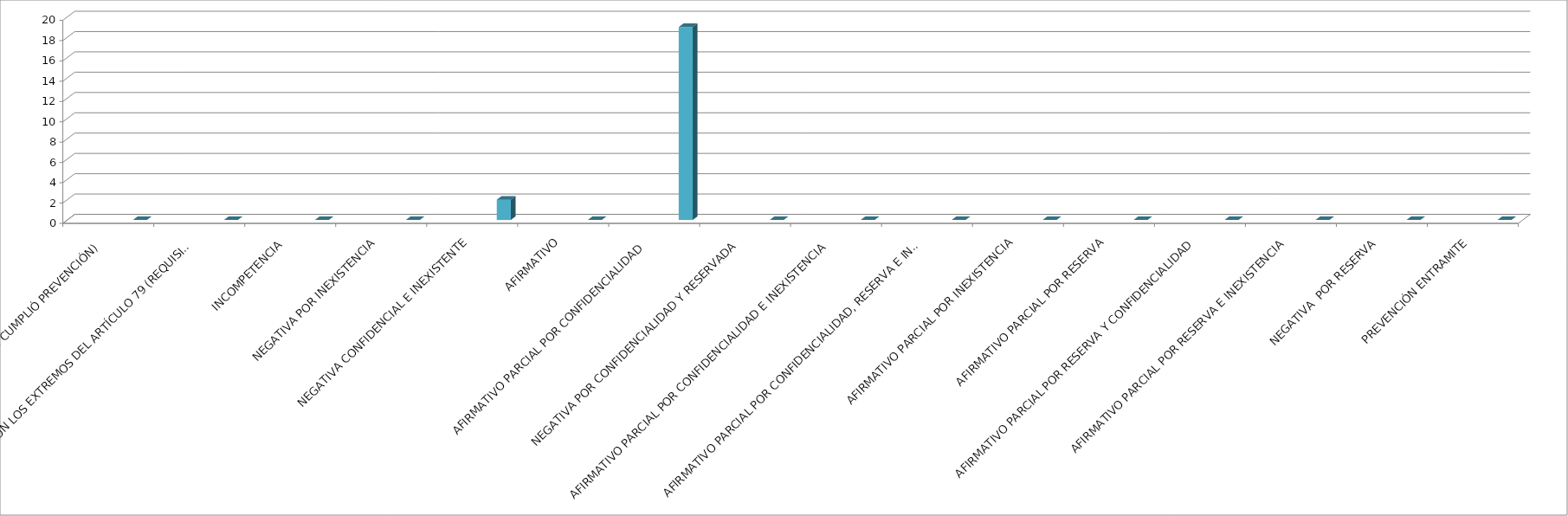
| Category | Series 0 | Series 1 | Series 2 | Series 3 | Series 4 |
|---|---|---|---|---|---|
| SE TIENE POR NO PRESENTADA ( NO CUMPLIÓ PREVENCIÓN) |  |  |  |  | 0 |
| NO CUMPLIO CON LOS EXTREMOS DEL ARTÍCULO 79 (REQUISITOS) |  |  |  |  | 0 |
| INCOMPETENCIA  |  |  |  |  | 0 |
| NEGATIVA POR INEXISTENCIA |  |  |  |  | 0 |
| NEGATIVA CONFIDENCIAL E INEXISTENTE |  |  |  |  | 2 |
| AFIRMATIVO |  |  |  |  | 0 |
| AFIRMATIVO PARCIAL POR CONFIDENCIALIDAD  |  |  |  |  | 19 |
| NEGATIVA POR CONFIDENCIALIDAD Y RESERVADA |  |  |  |  | 0 |
| AFIRMATIVO PARCIAL POR CONFIDENCIALIDAD E INEXISTENCIA |  |  |  |  | 0 |
| AFIRMATIVO PARCIAL POR CONFIDENCIALIDAD, RESERVA E INEXISTENCIA |  |  |  |  | 0 |
| AFIRMATIVO PARCIAL POR INEXISTENCIA |  |  |  |  | 0 |
| AFIRMATIVO PARCIAL POR RESERVA |  |  |  |  | 0 |
| AFIRMATIVO PARCIAL POR RESERVA Y CONFIDENCIALIDAD |  |  |  |  | 0 |
| AFIRMATIVO PARCIAL POR RESERVA E INEXISTENCIA |  |  |  |  | 0 |
| NEGATIVA  POR RESERVA |  |  |  |  | 0 |
| PREVENCIÓN ENTRAMITE |  |  |  |  | 0 |